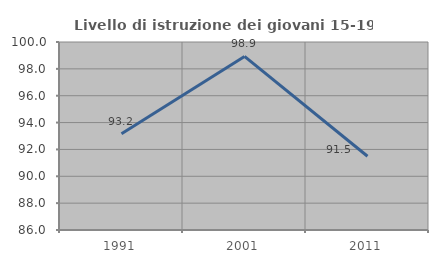
| Category | Livello di istruzione dei giovani 15-19 anni |
|---|---|
| 1991.0 | 93.162 |
| 2001.0 | 98.925 |
| 2011.0 | 91.489 |